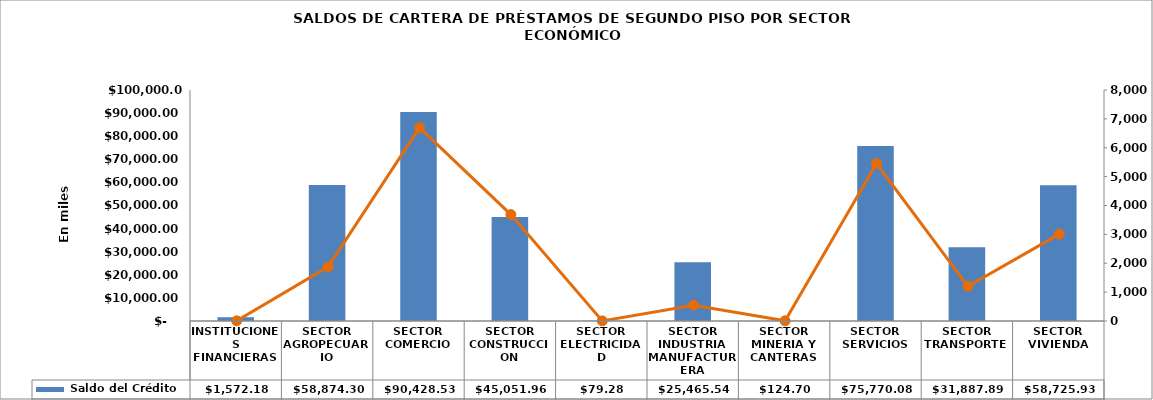
| Category |  Saldo del Crédito |
|---|---|
| INSTITUCIONES FINANCIERAS | 1572.177 |
| SECTOR AGROPECUARIO | 58874.304 |
| SECTOR COMERCIO | 90428.533 |
| SECTOR CONSTRUCCION | 45051.962 |
| SECTOR ELECTRICIDAD | 79.28 |
| SECTOR INDUSTRIA MANUFACTURERA | 25465.538 |
| SECTOR MINERIA Y CANTERAS | 124.697 |
| SECTOR SERVICIOS | 75770.077 |
| SECTOR TRANSPORTE | 31887.891 |
| SECTOR VIVIENDA | 58725.927 |